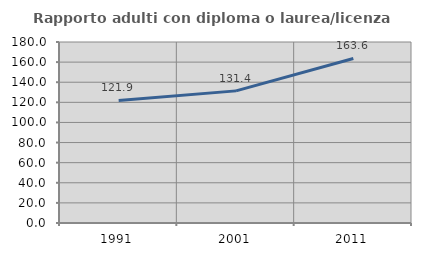
| Category | Rapporto adulti con diploma o laurea/licenza media  |
|---|---|
| 1991.0 | 121.881 |
| 2001.0 | 131.399 |
| 2011.0 | 163.636 |